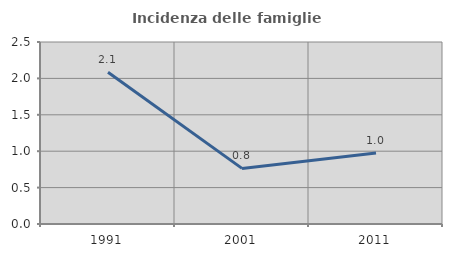
| Category | Incidenza delle famiglie numerose |
|---|---|
| 1991.0 | 2.085 |
| 2001.0 | 0.764 |
| 2011.0 | 0.974 |